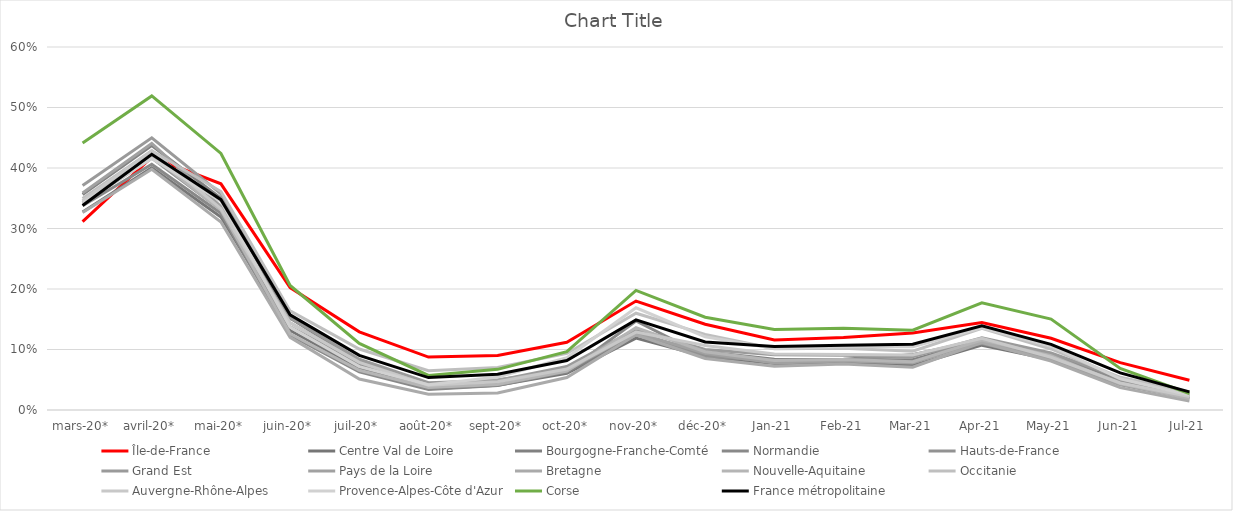
| Category | Île-de-France | Centre Val de Loire | Bourgogne-Franche-Comté | Normandie | Hauts-de-France | Grand Est | Pays de la Loire | Bretagne | Nouvelle-Aquitaine | Occitanie | Auvergne-Rhône-Alpes | Provence-Alpes-Côte d'Azur | Corse | France métropolitaine |
|---|---|---|---|---|---|---|---|---|---|---|---|---|---|---|
| mars-20* | 0.311 | 0.327 | 0.356 | 0.338 | 0.342 | 0.371 | 0.359 | 0.327 | 0.346 | 0.35 | 0.346 | 0.342 | 0.441 | 0.338 |
| avril-20* | 0.418 | 0.4 | 0.437 | 0.406 | 0.416 | 0.45 | 0.441 | 0.398 | 0.42 | 0.428 | 0.429 | 0.416 | 0.519 | 0.423 |
| mai-20* | 0.374 | 0.319 | 0.35 | 0.325 | 0.331 | 0.357 | 0.336 | 0.311 | 0.331 | 0.361 | 0.333 | 0.345 | 0.424 | 0.348 |
| juin-20* | 0.202 | 0.131 | 0.152 | 0.124 | 0.137 | 0.153 | 0.144 | 0.12 | 0.126 | 0.164 | 0.144 | 0.137 | 0.206 | 0.157 |
| juil-20* | 0.129 | 0.069 | 0.081 | 0.063 | 0.076 | 0.084 | 0.079 | 0.051 | 0.066 | 0.101 | 0.079 | 0.072 | 0.11 | 0.09 |
| août-20* | 0.087 | 0.035 | 0.038 | 0.034 | 0.038 | 0.045 | 0.041 | 0.026 | 0.037 | 0.065 | 0.041 | 0.042 | 0.057 | 0.054 |
| sept-20* | 0.09 | 0.041 | 0.046 | 0.04 | 0.044 | 0.049 | 0.05 | 0.028 | 0.042 | 0.07 | 0.047 | 0.055 | 0.067 | 0.059 |
| oct-20* | 0.112 | 0.061 | 0.062 | 0.063 | 0.071 | 0.072 | 0.065 | 0.054 | 0.064 | 0.093 | 0.068 | 0.086 | 0.096 | 0.082 |
| nov-20* | 0.18 | 0.119 | 0.124 | 0.147 | 0.128 | 0.134 | 0.128 | 0.124 | 0.136 | 0.16 | 0.129 | 0.169 | 0.198 | 0.149 |
| déc-20* | 0.142 | 0.088 | 0.096 | 0.089 | 0.09 | 0.1 | 0.094 | 0.085 | 0.096 | 0.125 | 0.107 | 0.121 | 0.153 | 0.112 |
| janv-21 | 0.116 | 0.077 | 0.084 | 0.082 | 0.08 | 0.091 | 0.078 | 0.072 | 0.082 | 0.101 | 0.093 | 0.102 | 0.133 | 0.105 |
| févr-21 | 0.12 | 0.078 | 0.083 | 0.084 | 0.082 | 0.091 | 0.081 | 0.076 | 0.084 | 0.102 | 0.092 | 0.105 | 0.135 | 0.107 |
| mars-21 | 0.127 | 0.074 | 0.083 | 0.091 | 0.091 | 0.088 | 0.078 | 0.071 | 0.08 | 0.097 | 0.091 | 0.105 | 0.132 | 0.109 |
| avr-21 | 0.144 | 0.107 | 0.114 | 0.116 | 0.11 | 0.119 | 0.114 | 0.111 | 0.116 | 0.135 | 0.119 | 0.136 | 0.177 | 0.139 |
| mai-21 | 0.119 | 0.084 | 0.089 | 0.093 | 0.084 | 0.094 | 0.083 | 0.081 | 0.09 | 0.101 | 0.087 | 0.105 | 0.15 | 0.109 |
| juin-21 | 0.078 | 0.042 | 0.051 | 0.051 | 0.048 | 0.053 | 0.042 | 0.037 | 0.044 | 0.054 | 0.045 | 0.052 | 0.069 | 0.061 |
| juil-21 | 0.049 | 0.019 | 0.024 | 0.026 | 0.025 | 0.026 | 0.02 | 0.015 | 0.019 | 0.029 | 0.022 | 0.025 | 0.027 | 0.03 |